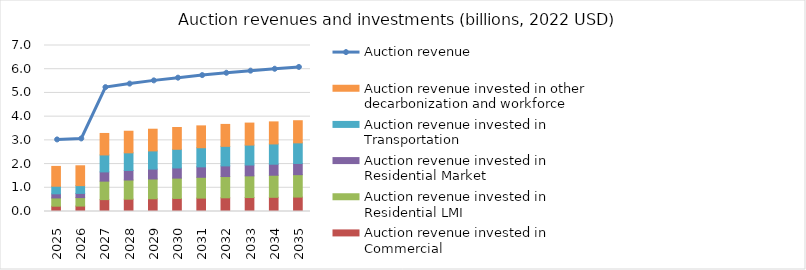
| Category | Auction revenue invested in Commercial | Auction revenue invested in Residential LMI | Auction revenue invested in Residential Market | Auction revenue invested in Transportation | Auction revenue invested in other decarbonization and workforce |
|---|---|---|---|---|---|
| 2025.0 | 0.224 | 0.348 | 0.174 | 0.319 | 0.836 |
| 2026.0 | 0.229 | 0.356 | 0.178 | 0.327 | 0.838 |
| 2027.0 | 0.501 | 0.779 | 0.39 | 0.716 | 0.906 |
| 2028.0 | 0.52 | 0.808 | 0.404 | 0.742 | 0.911 |
| 2029.0 | 0.537 | 0.835 | 0.417 | 0.767 | 0.915 |
| 2030.0 | 0.551 | 0.857 | 0.429 | 0.787 | 0.918 |
| 2031.0 | 0.565 | 0.878 | 0.439 | 0.807 | 0.922 |
| 2032.0 | 0.577 | 0.897 | 0.449 | 0.824 | 0.925 |
| 2033.0 | 0.588 | 0.915 | 0.457 | 0.84 | 0.928 |
| 2034.0 | 0.598 | 0.931 | 0.465 | 0.855 | 0.93 |
| 2035.0 | 0.608 | 0.946 | 0.473 | 0.868 | 0.933 |